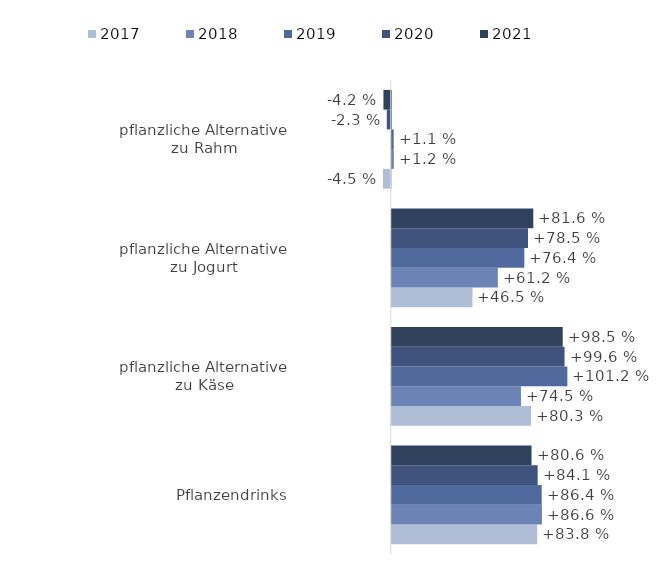
| Category | 2017 | 2018 | 2019 | 2020 | 2021 |
|---|---|---|---|---|---|
| Pflanzendrinks | 0.838 | 0.866 | 0.864 | 0.841 | 0.806 |
| pflanzliche Alternative zu Käse | 0.803 | 0.745 | 1.012 | 0.996 | 0.985 |
| pflanzliche Alternative zu Jogurt | 0.465 | 0.612 | 0.764 | 0.785 | 0.816 |
| pflanzliche Alternative zu Rahm | -0.045 | 0.012 | 0.011 | -0.023 | -0.042 |